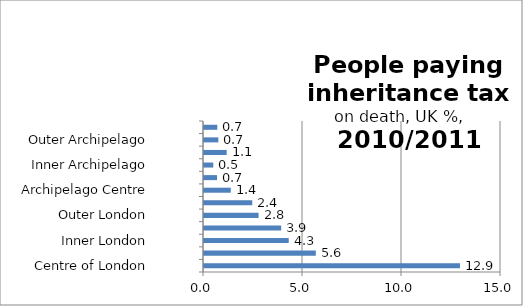
| Category | Series 0 |
|---|---|
| Centre of London | 12.927 |
| London Core | 5.647 |
| Inner London | 4.279 |
| London Suburbs | 3.898 |
| Outer London | 2.757 |
| London Edge | 2.439 |
| Archipelago Centre | 1.352 |
| Archipelago Core | 0.659 |
| Inner Archipelago | 0.469 |
| Archipelago Suburbs | 1.147 |
| Outer Archipelago | 0.723 |
| Archipelago Edge | 0.671 |